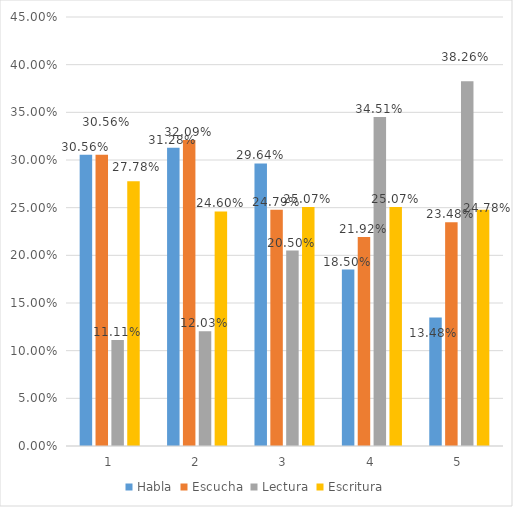
| Category | Habla | Escucha | Lectura | Escritura |
|---|---|---|---|---|
| 0 | 0.306 | 0.306 | 0.111 | 0.278 |
| 1 | 0.313 | 0.321 | 0.12 | 0.246 |
| 2 | 0.296 | 0.248 | 0.205 | 0.251 |
| 3 | 0.185 | 0.219 | 0.345 | 0.251 |
| 4 | 0.135 | 0.235 | 0.383 | 0.248 |